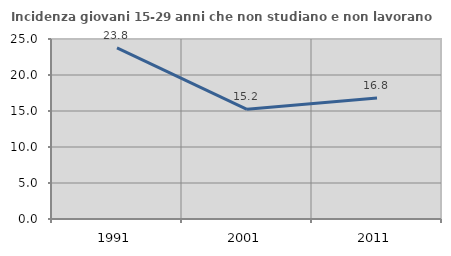
| Category | Incidenza giovani 15-29 anni che non studiano e non lavorano  |
|---|---|
| 1991.0 | 23.76 |
| 2001.0 | 15.238 |
| 2011.0 | 16.817 |